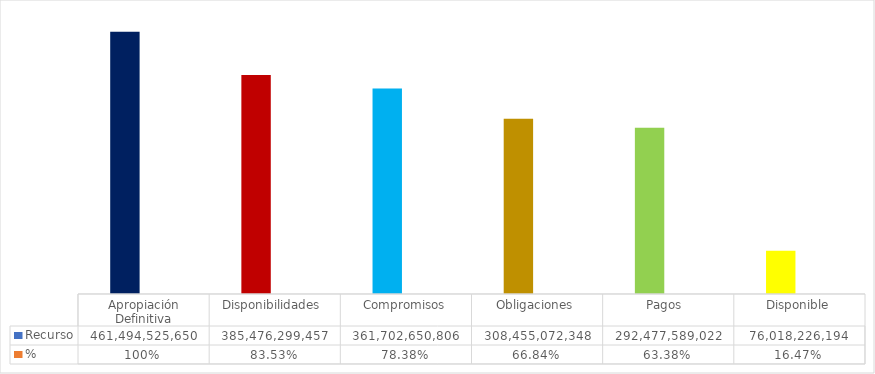
| Category | Recurso  | % |
|---|---|---|
| Apropiación Definitiva | 461494525650.15 | 1 |
| Disponibilidades  | 385476299456.59 | 0.835 |
| Compromisos | 361702650805.86 | 0.784 |
| Obligaciones | 308455072348 | 0.668 |
| Pagos  | 292477589021.78 | 0.634 |
| Disponible | 76018226193.56 | 0.165 |